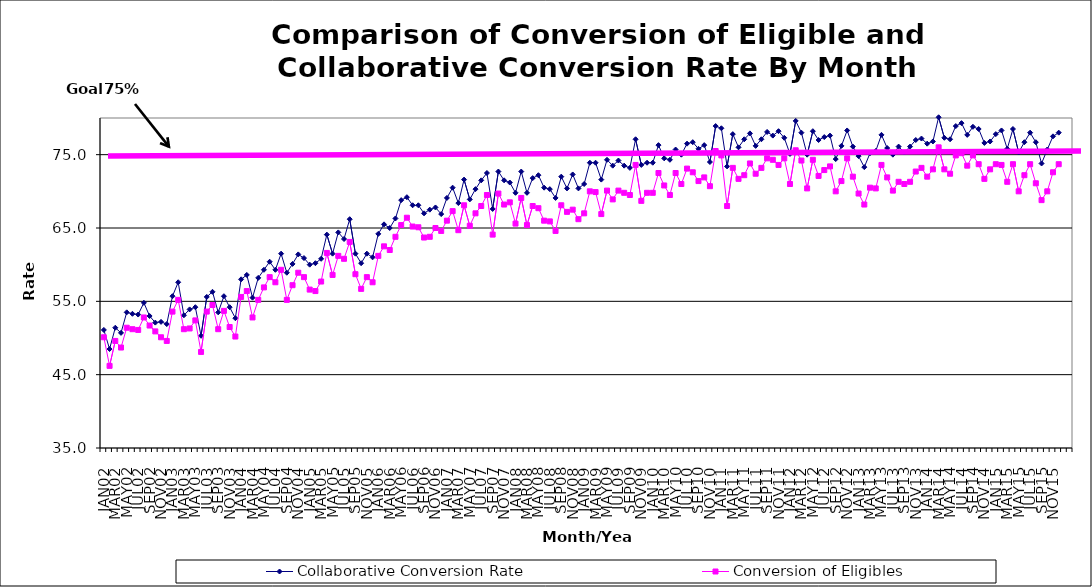
| Category | Collaborative Conversion Rate | Conversion of Eligibles |
|---|---|---|
| JAN02 | 51.1 | 50.1 |
| FEB02 | 48.5 | 46.2 |
| MAR02 | 51.4 | 49.6 |
| APR02 | 50.7 | 48.7 |
| MAY02 | 53.5 | 51.4 |
| JUN02 | 53.3 | 51.2 |
| JUL02 | 53.2 | 51.1 |
| AUG02 | 54.8 | 52.8 |
| SEP02 | 53 | 51.7 |
| OCT02 | 52.1 | 50.9 |
| NOV02 | 52.2 | 50.1 |
| DEC02 | 51.9 | 49.6 |
| JAN03 | 55.7 | 53.6 |
| FEB03 | 57.6 | 55.2 |
| MAR03 | 53.1 | 51.2 |
| APR03 | 53.9 | 51.3 |
| MAY03 | 54.2 | 52.4 |
| JUN03 | 50.3 | 48.1 |
| JUL03 | 55.6 | 53.6 |
| AUG03 | 56.3 | 54.5 |
| SEP03 | 53.5 | 51.2 |
| OCT03 | 55.7 | 53.7 |
| NOV03 | 54.2 | 51.5 |
| DEC03 | 52.7 | 50.2 |
| JAN04 | 58 | 55.6 |
| FEB04 | 58.6 | 56.4 |
| MAR04 | 55.5 | 52.8 |
| APR04 | 58.2 | 55.2 |
| MAY04 | 59.3 | 56.9 |
| JUN04 | 60.4 | 58.3 |
| JUL04 | 59.3 | 57.6 |
| AUG04 | 61.5 | 59.3 |
| SEP04 | 58.9 | 55.2 |
| OCT04 | 60.1 | 57.2 |
| NOV04 | 61.4 | 58.9 |
| DEC04 | 60.9 | 58.3 |
| JAN05 | 60 | 56.6 |
| FEB05 | 60.2 | 56.4 |
| MAR05 | 60.8 | 57.7 |
| APR05 | 64.1 | 61.6 |
| MAY05 | 61.5 | 58.6 |
| JUN05 | 64.4 | 61.2 |
| JUL05 | 63.5 | 60.8 |
| AUG05 | 66.2 | 63.1 |
| SEP05 | 61.5 | 58.7 |
| OCT05 | 60.2 | 56.7 |
| NOV05 | 61.5 | 58.3 |
| DEC05 | 61 | 57.6 |
| JAN06 | 64.2 | 61.2 |
| FEB06 | 65.5 | 62.5 |
| MAR06 | 65 | 62 |
| APR06 | 66.3 | 63.8 |
| MAY06 | 68.8 | 65.4 |
| JUN06 | 69.2 | 66.4 |
| JUL06 | 68.1 | 65.2 |
| AUG06 | 68.1 | 65.1 |
| SEP06 | 67 | 63.7 |
| OCT06 | 67.5 | 63.8 |
| NOV06 | 67.8 | 65 |
| DEC06 | 66.9 | 64.6 |
| JAN07 | 69.1 | 66 |
| FEB07 | 70.5 | 67.3 |
| MAR07 | 68.4 | 64.7 |
| APR07 | 71.6 | 68.1 |
| MAY07 | 68.9 | 65.3 |
| JUN07 | 70.3 | 67 |
| JUL07 | 71.5 | 68 |
| AUG07 | 72.5 | 69.5 |
| SEP07 | 67.6 | 64.1 |
| OCT07 | 72.7 | 69.7 |
| NOV07 | 71.5 | 68.2 |
| DEC07 | 71.2 | 68.5 |
| JAN08 | 69.8 | 65.6 |
| FEB08 | 72.7 | 69.1 |
| MAR08 | 69.8 | 65.4 |
| APR08 | 71.8 | 68 |
| MAY08 | 72.2 | 67.7 |
| JUN08 | 70.5 | 66 |
| JUL08 | 70.3 | 65.9 |
| AUG08 | 69.1 | 64.6 |
| SEP08 | 72 | 68.1 |
| OCT08 | 70.4 | 67.2 |
| NOV08 | 72.3 | 67.5 |
| DEC08 | 70.4 | 66.2 |
| JAN09 | 71 | 67 |
| FEB09 | 73.9 | 70 |
| MAR09 | 73.9 | 69.9 |
| APR09 | 71.6 | 66.9 |
| MAY09 | 74.3 | 70.1 |
| JUN09 | 73.5 | 68.9 |
| JUL09 | 74.2 | 70.1 |
| AUG09 | 73.5 | 69.8 |
| SEP09 | 73.2 | 69.5 |
| OCT09 | 77.1 | 73.6 |
| NOV09 | 73.6 | 68.7 |
| DEC09 | 73.9 | 69.8 |
| JAN10 | 73.9 | 69.8 |
| FEB10 | 76.3 | 72.5 |
| MAR10 | 74.5 | 70.8 |
| APR10 | 74.3 | 69.5 |
| MAY10 | 75.7 | 72.5 |
| JUN10 | 75 | 71 |
| JUL10 | 76.5 | 73.1 |
| AUG10 | 76.7 | 72.6 |
| SEP10 | 75.8 | 71.4 |
| OCT10 | 76.3 | 71.9 |
| NOV10 | 74 | 70.7 |
| DEC10 | 78.9 | 75.5 |
| JAN11 | 78.6 | 74.9 |
| FEB11 | 73.4 | 68 |
| MAR11 | 77.8 | 73.2 |
| APR11 | 76 | 71.7 |
| MAY11 | 77.1 | 72.2 |
| JUN11 | 77.9 | 73.8 |
| JUL11 | 76.2 | 72.4 |
| AUG11 | 77.1 | 73.2 |
| SEP11 | 78.1 | 74.5 |
| OCT11 | 77.6 | 74.3 |
| NOV11 | 78.2 | 73.6 |
| DEC11 | 77.3 | 74.5 |
| JAN12 | 75.1 | 71 |
| FEB12 | 79.6 | 75.6 |
| MAR12 | 78 | 74.2 |
| APR12 | 75 | 70.4 |
| MAY12 | 78.2 | 74.3 |
| JUN12 | 77 | 72.1 |
| JUL12 | 77.4 | 72.9 |
| AUG12 | 77.6 | 73.4 |
| SEP12 | 74.4 | 70 |
| OCT12 | 76.2 | 71.4 |
| NOV12 | 78.3 | 74.5 |
| DEC12 | 76.1 | 72 |
| JAN13 | 74.8 | 69.7 |
| FEB13 | 73.3 | 68.2 |
| MAR13 | 75.2 | 70.5 |
| APR13 | 75.5 | 70.4 |
| MAY13 | 77.7 | 73.6 |
| JUN13 | 75.9 | 71.9 |
| JUL13 | 75 | 70.1 |
| AUG13 | 76.1 | 71.3 |
| SEP13 | 75.3 | 71 |
| OCT13 | 76.1 | 71.3 |
| NOV13 | 77 | 72.7 |
| DEC13 | 77.2 | 73.2 |
| JAN14 | 76.5 | 72 |
| FEB14 | 76.8 | 73 |
| MAR14 | 80.1 | 76 |
| APR14 | 77.3 | 73 |
| MAY14 | 77.1 | 72.4 |
| JUN14 | 78.9 | 74.9 |
| JUL14 | 79.3 | 75.2 |
| AUG14 | 77.7 | 73.5 |
| SEP14 | 78.8 | 74.9 |
| OCT14 | 78.5 | 73.7 |
| NOV14 | 76.6 | 71.7 |
| DEC14 | 76.8 | 73 |
| JAN15 | 77.8 | 73.7 |
| FEB15 | 78.3 | 73.6 |
| MAR15 | 75.8 | 71.3 |
| APR15 | 78.5 | 73.7 |
| MAY15 | 75.3 | 70 |
| JUN15 | 76.7 | 72.2 |
| JUL15 | 78 | 73.7 |
| AUG15 | 76.7 | 71.1 |
| SEP15 | 73.8 | 68.8 |
| OCT15 | 75.7 | 70 |
| NOV15 | 77.5 | 72.6 |
| DEC15 | 78 | 73.7 |